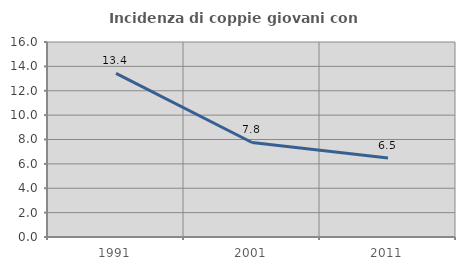
| Category | Incidenza di coppie giovani con figli |
|---|---|
| 1991.0 | 13.419 |
| 2001.0 | 7.756 |
| 2011.0 | 6.483 |